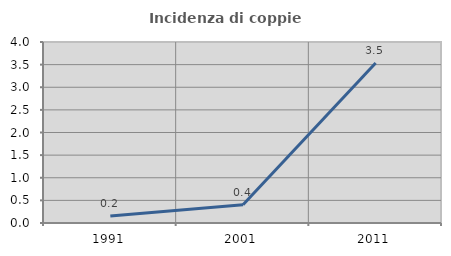
| Category | Incidenza di coppie miste |
|---|---|
| 1991.0 | 0.153 |
| 2001.0 | 0.402 |
| 2011.0 | 3.536 |